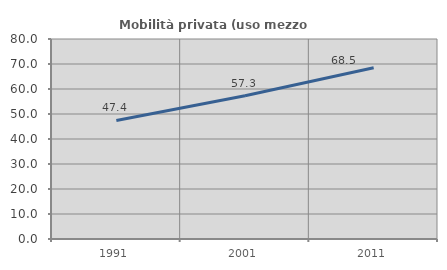
| Category | Mobilità privata (uso mezzo privato) |
|---|---|
| 1991.0 | 47.423 |
| 2001.0 | 57.317 |
| 2011.0 | 68.488 |